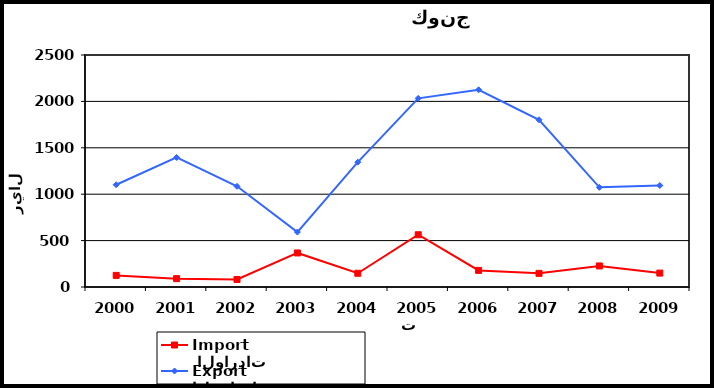
| Category |  الواردات           Import | الصادرات          Export |
|---|---|---|
| 2000.0 | 125 | 1102 |
| 2001.0 | 90 | 1396 |
| 2002.0 | 81 | 1085 |
| 2003.0 | 367 | 592 |
| 2004.0 | 148 | 1345 |
| 2005.0 | 563 | 2033 |
| 2006.0 | 179 | 2125 |
| 2007.0 | 147 | 1802 |
| 2008.0 | 227 | 1074 |
| 2009.0 | 150 | 1094 |